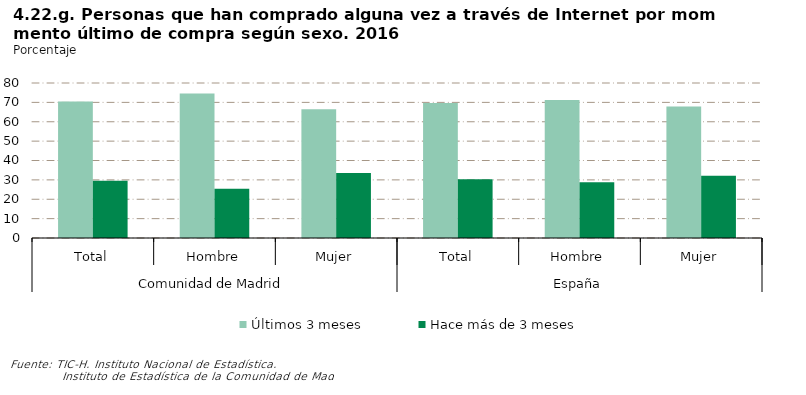
| Category | Últimos 3 meses | Hace más de 3 meses |
|---|---|---|
| 0 | 70.516 | 29.484 |
| 1 | 74.572 | 25.428 |
| 2 | 66.514 | 33.486 |
| 3 | 69.613 | 30.387 |
| 4 | 71.204 | 28.796 |
| 5 | 67.832 | 32.168 |